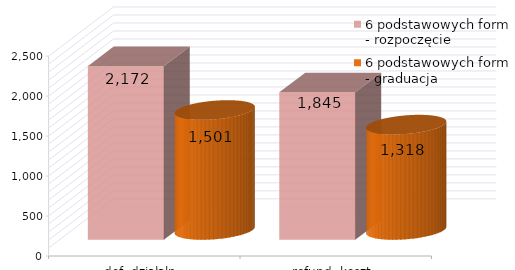
| Category | 6 podstawowych form - rozpoczęcie | 6 podstawowych form - graduacja |
|---|---|---|
| dof. działaln. | 2172 | 1501 |
| refund. koszt. | 1845 | 1318 |